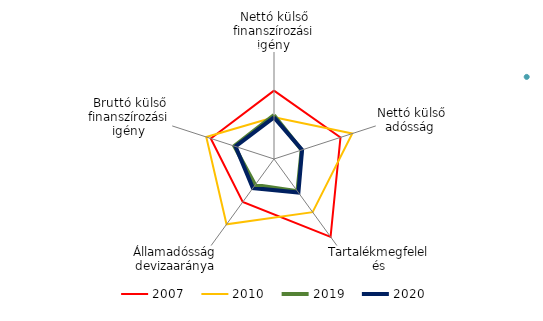
| Category | 2007 | 2008 | 2010 | 2019 | 2020 |
|---|---|---|---|---|---|
| Nettó külső finanszírozási igény | 0.832 |  | -0.661 | -0.541 | -0.663 |
| Nettó külső adósság  | 0.919 |  | 1.616 | -1.371 | -1.344 |
| Tartalékmegfelelés | 2.396 |  | 0.683 | -0.764 | -0.672 |
| Államadósság devizaaránya | -0.019 |  | 1.529 | -1.205 | -0.985 |
| Bruttó külső finanszírozási igény | 0.727 |  | 0.993 | -0.657 | -0.732 |